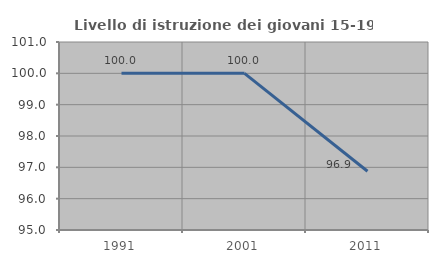
| Category | Livello di istruzione dei giovani 15-19 anni |
|---|---|
| 1991.0 | 100 |
| 2001.0 | 100 |
| 2011.0 | 96.875 |